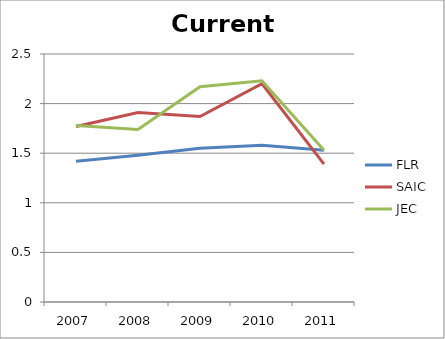
| Category | FLR | SAIC | JEC |
|---|---|---|---|
| 2007.0 | 1.42 | 1.77 | 1.78 |
| 2008.0 | 1.48 | 1.91 | 1.74 |
| 2009.0 | 1.55 | 1.87 | 2.17 |
| 2010.0 | 1.58 | 2.2 | 2.23 |
| 2011.0 | 1.53 | 1.39 | 1.53 |